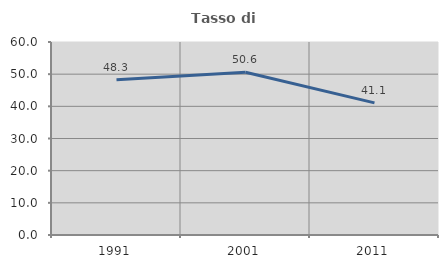
| Category | Tasso di occupazione   |
|---|---|
| 1991.0 | 48.287 |
| 2001.0 | 50.615 |
| 2011.0 | 41.082 |